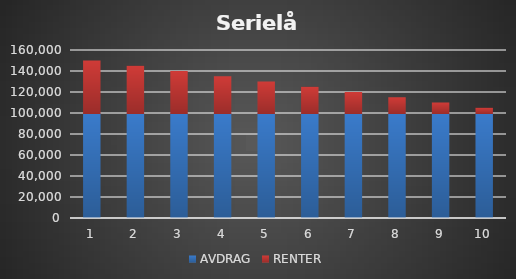
| Category | AVDRAG | RENTER |
|---|---|---|
| 0 | 100000 | 50000 |
| 1 | 100000 | 45000 |
| 2 | 100000 | 40000 |
| 3 | 100000 | 35000 |
| 4 | 100000 | 30000 |
| 5 | 100000 | 25000 |
| 6 | 100000 | 20000 |
| 7 | 100000 | 15000 |
| 8 | 100000 | 10000 |
| 9 | 100000 | 5000 |